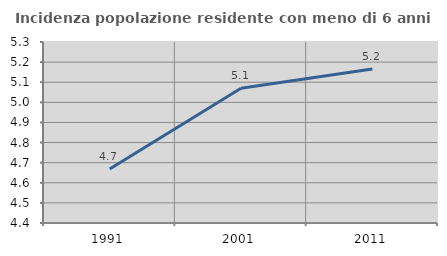
| Category | Incidenza popolazione residente con meno di 6 anni |
|---|---|
| 1991.0 | 4.669 |
| 2001.0 | 5.07 |
| 2011.0 | 5.166 |